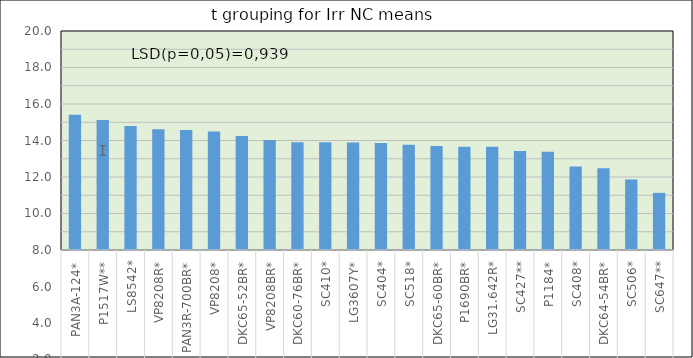
| Category | Series 0 |
|---|---|
| 0 | 15.413 |
| 1 | 15.124 |
| 2 | 14.796 |
| 3 | 14.617 |
| 4 | 14.569 |
| 5 | 14.488 |
| 6 | 14.25 |
| 7 | 14.026 |
| 8 | 13.91 |
| 9 | 13.898 |
| 10 | 13.885 |
| 11 | 13.87 |
| 12 | 13.764 |
| 13 | 13.701 |
| 14 | 13.66 |
| 15 | 13.651 |
| 16 | 13.423 |
| 17 | 13.379 |
| 18 | 12.58 |
| 19 | 12.486 |
| 20 | 11.859 |
| 21 | 11.132 |